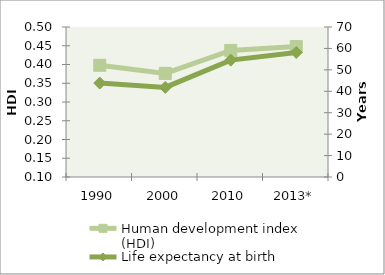
| Category | Human development index (HDI) |
|---|---|
| 1990 | 0.398 |
| 2000 | 0.376 |
| 2010 | 0.438 |
| 2013* | 0.448 |